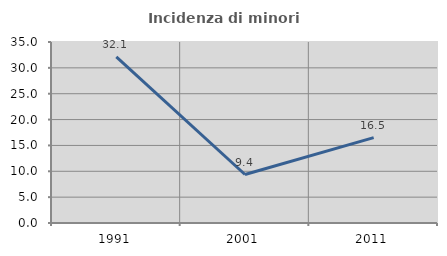
| Category | Incidenza di minori stranieri |
|---|---|
| 1991.0 | 32.143 |
| 2001.0 | 9.375 |
| 2011.0 | 16.505 |